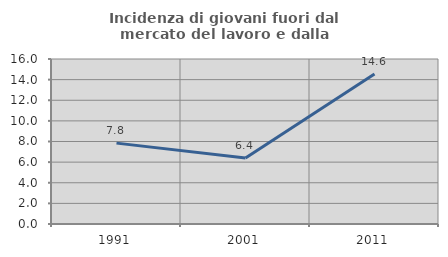
| Category | Incidenza di giovani fuori dal mercato del lavoro e dalla formazione  |
|---|---|
| 1991.0 | 7.843 |
| 2001.0 | 6.407 |
| 2011.0 | 14.55 |